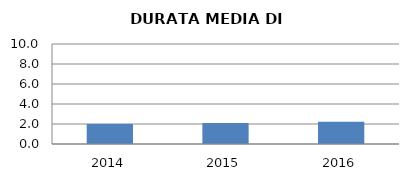
| Category | 2014 2015 2016 |
|---|---|
| 2014.0 | 2 |
| 2015.0 | 2.111 |
| 2016.0 | 2.222 |